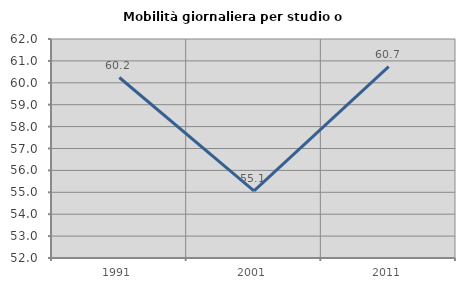
| Category | Mobilità giornaliera per studio o lavoro |
|---|---|
| 1991.0 | 60.241 |
| 2001.0 | 55.068 |
| 2011.0 | 60.738 |